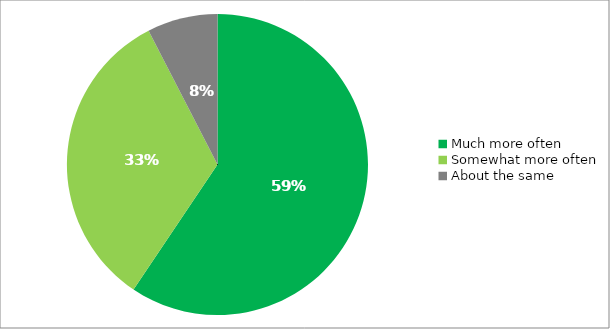
| Category | Responses |
|---|---|
| Much more often | 0.594 |
| Somewhat more often | 0.33 |
| About the same | 0.076 |